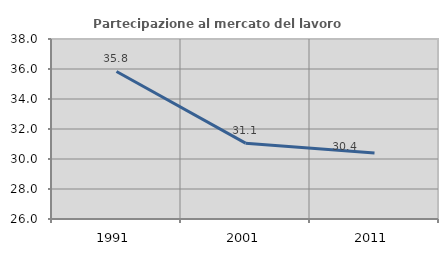
| Category | Partecipazione al mercato del lavoro  femminile |
|---|---|
| 1991.0 | 35.834 |
| 2001.0 | 31.056 |
| 2011.0 | 30.393 |